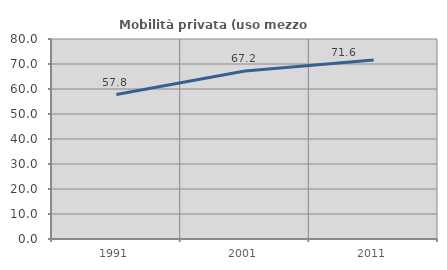
| Category | Mobilità privata (uso mezzo privato) |
|---|---|
| 1991.0 | 57.795 |
| 2001.0 | 67.236 |
| 2011.0 | 71.638 |